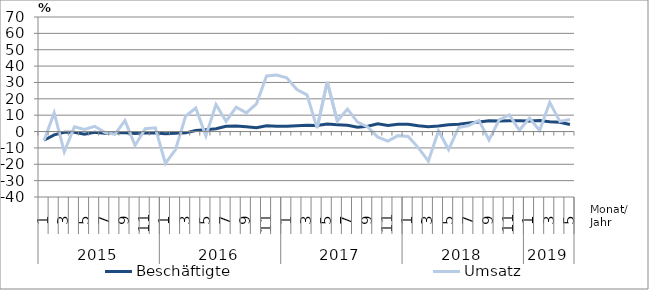
| Category | Beschäftigte | Umsatz |
|---|---|---|
| 0 | -5.3 | -5.5 |
| 1 | -2 | 11.4 |
| 2 | -0.5 | -12.4 |
| 3 | -0.5 | 2.9 |
| 4 | -1.7 | 1.3 |
| 5 | -0.5 | 3.2 |
| 6 | -1.1 | -0.5 |
| 7 | -0.8 | -1.7 |
| 8 | -0.7 | 6.7 |
| 9 | -1.2 | -8.5 |
| 10 | -0.7 | 1.7 |
| 11 | -0.9 | 2.3 |
| 12 | -1.3 | -19.4 |
| 13 | -1.1 | -11 |
| 14 | -0.8 | 9.4 |
| 15 | 0.6 | 14.4 |
| 16 | 1.1 | -2.6 |
| 17 | 1.7 | 16.5 |
| 18 | 3.2 | 6.3 |
| 19 | 3.4 | 14.9 |
| 20 | 3 | 11.4 |
| 21 | 2.4 | 16.9 |
| 22 | 3.6 | 34 |
| 23 | 3.2 | 34.5 |
| 24 | 3.3 | 32.8 |
| 25 | 3.6 | 25.7 |
| 26 | 3.9 | 22.4 |
| 27 | 3.7 | 2.1 |
| 28 | 4.6 | 30.4 |
| 29 | 4.2 | 6.4 |
| 30 | 3.8 | 13.7 |
| 31 | 2.7 | 5.8 |
| 32 | 3.3 | 2.8 |
| 33 | 4.7 | -3.4 |
| 34 | 3.7 | -5.8 |
| 35 | 4.4 | -2.5 |
| 36 | 4.5 | -3 |
| 37 | 3.6 | -9.8 |
| 38 | 2.9 | -18.1 |
| 39 | 3.4 | 0.5 |
| 40 | 4.2 | -11 |
| 41 | 4.5 | 2.5 |
| 42 | 5.3 | 3.7 |
| 43 | 5.8 | 6.8 |
| 44 | 6.6 | -5.2 |
| 45 | 6.5 | 7.1 |
| 46 | 6.6 | 10.1 |
| 47 | 6.6 | 0.8 |
| 48 | 6.4 | 8.2 |
| 49 | 6.7 | 0.6 |
| 50 | 6 | 17.8 |
| 51 | 5.7 | 6.2 |
| 52 | 4.3 | 7.3 |